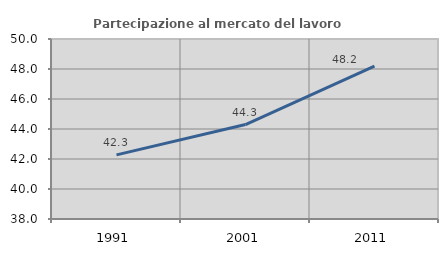
| Category | Partecipazione al mercato del lavoro  femminile |
|---|---|
| 1991.0 | 42.276 |
| 2001.0 | 44.299 |
| 2011.0 | 48.199 |